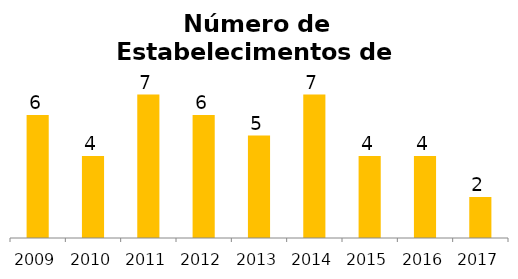
| Category | Aluguel de Transporte |
|---|---|
| 2009.0 | 6 |
| 2010.0 | 4 |
| 2011.0 | 7 |
| 2012.0 | 6 |
| 2013.0 | 5 |
| 2014.0 | 7 |
| 2015.0 | 4 |
| 2016.0 | 4 |
| 2017.0 | 2 |